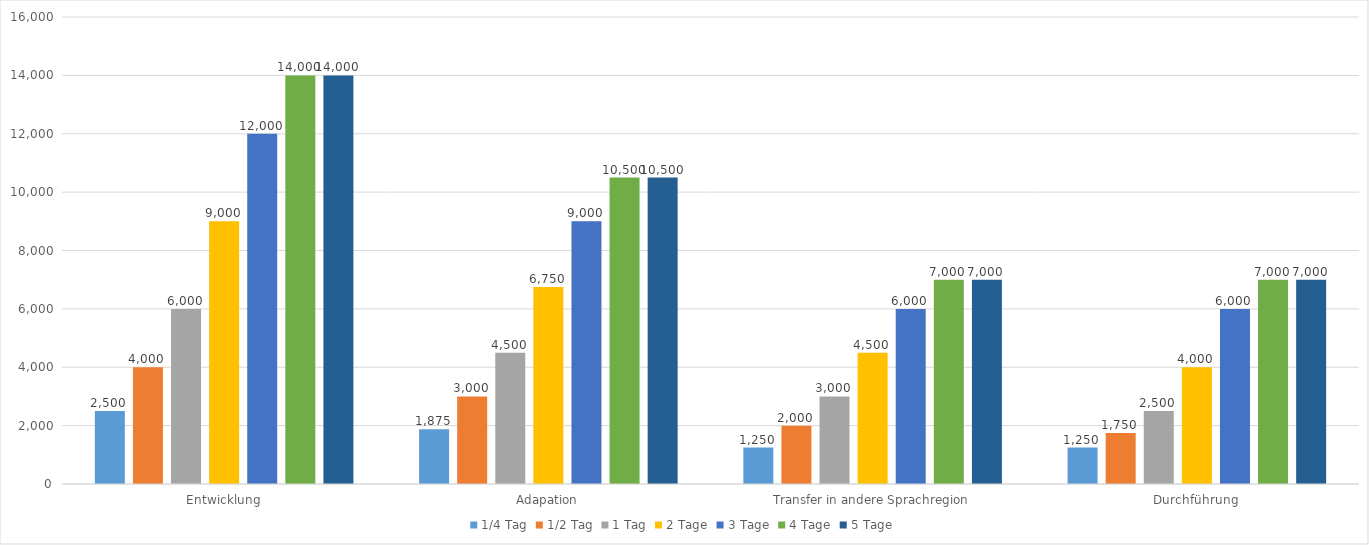
| Category | 1/4 Tag | 1/2 Tag | 1 Tag | 2 Tage | 3 Tage | 4 Tage | 5 Tage |
|---|---|---|---|---|---|---|---|
| Entwicklung | 2500 | 4000 | 6000 | 9000 | 12000 | 14000 | 14000 |
| Adapation | 1875 | 3000 | 4500 | 6750 | 9000 | 10500 | 10500 |
| Transfer in andere Sprachregion | 1250 | 2000 | 3000 | 4500 | 6000 | 7000 | 7000 |
| Durchführung | 1250 | 1750 | 2500 | 4000 | 6000 | 7000 | 7000 |